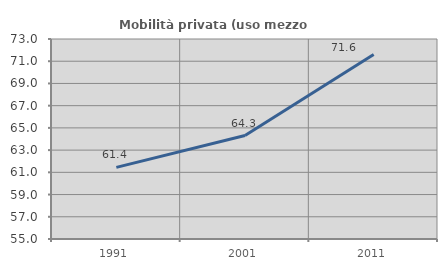
| Category | Mobilità privata (uso mezzo privato) |
|---|---|
| 1991.0 | 61.446 |
| 2001.0 | 64.314 |
| 2011.0 | 71.6 |